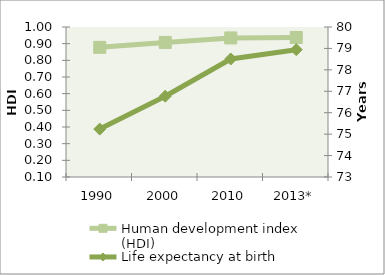
| Category | Human development index (HDI) |
|---|---|
| 1990 | 0.878 |
| 2000 | 0.907 |
| 2010 | 0.934 |
| 2013* | 0.937 |